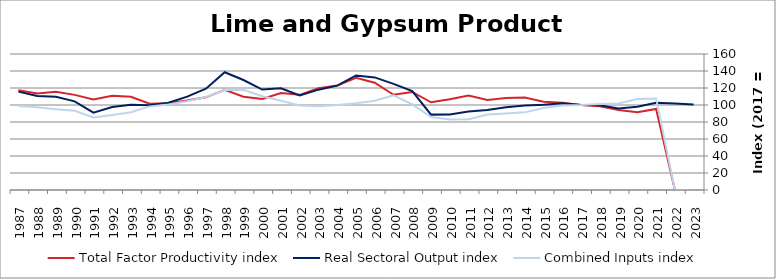
| Category | Total Factor Productivity index | Real Sectoral Output index | Combined Inputs index |
|---|---|---|---|
| 2023.0 | 0 | 100.455 | 0 |
| 2022.0 | 0 | 101.856 | 0 |
| 2021.0 | 95.356 | 102.731 | 107.734 |
| 2020.0 | 91.409 | 97.919 | 107.122 |
| 2019.0 | 94.212 | 95.835 | 101.723 |
| 2018.0 | 98.394 | 99.63 | 101.256 |
| 2017.0 | 100 | 100 | 100 |
| 2016.0 | 102.539 | 102.072 | 99.544 |
| 2015.0 | 103.8 | 100.183 | 96.515 |
| 2014.0 | 108.879 | 99.458 | 91.347 |
| 2013.0 | 108.263 | 97.359 | 89.929 |
| 2012.0 | 105.862 | 93.997 | 88.792 |
| 2011.0 | 111.021 | 92.312 | 83.149 |
| 2010.0 | 106.883 | 88.766 | 83.049 |
| 2009.0 | 103.206 | 88.677 | 85.923 |
| 2008.0 | 115.341 | 116.279 | 100.813 |
| 2007.0 | 112.032 | 124.909 | 111.495 |
| 2006.0 | 126.171 | 132.454 | 104.98 |
| 2005.0 | 131.968 | 134.729 | 102.093 |
| 2004.0 | 122.879 | 122.747 | 99.893 |
| 2003.0 | 119.722 | 118.061 | 98.613 |
| 2002.0 | 111.951 | 111.369 | 99.48 |
| 2001.0 | 114.026 | 119.695 | 104.972 |
| 2000.0 | 107.062 | 118.159 | 110.365 |
| 1999.0 | 109.763 | 129.412 | 117.902 |
| 1998.0 | 117.808 | 138.566 | 117.62 |
| 1997.0 | 108.999 | 119.237 | 109.393 |
| 1996.0 | 105.219 | 109.798 | 104.353 |
| 1995.0 | 102.145 | 102.646 | 100.491 |
| 1994.0 | 101.498 | 99.814 | 98.341 |
| 1993.0 | 109.598 | 100.163 | 91.391 |
| 1992.0 | 110.754 | 97.596 | 88.119 |
| 1991.0 | 106.589 | 91.061 | 85.432 |
| 1990.0 | 111.923 | 104.296 | 93.186 |
| 1989.0 | 115.623 | 109.69 | 94.869 |
| 1988.0 | 113.652 | 110.544 | 97.265 |
| 1987.0 | 117.237 | 115.74 | 98.723 |